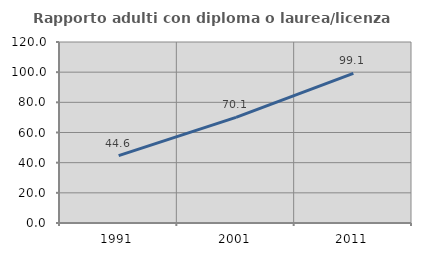
| Category | Rapporto adulti con diploma o laurea/licenza media  |
|---|---|
| 1991.0 | 44.631 |
| 2001.0 | 70.059 |
| 2011.0 | 99.141 |